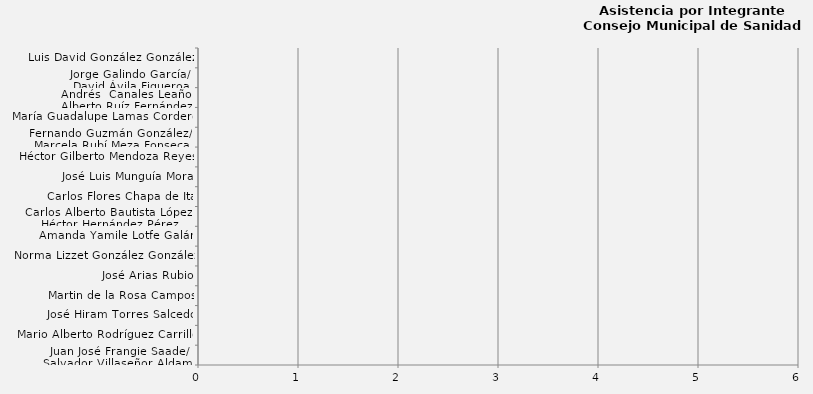
| Category | Series 0 |
|---|---|
| Juan José Frangie Saade/
Salvador Villaseñor Aldama | 0 |
| Mario Alberto Rodríguez Carrillo | 0 |
| José Hiram Torres Salcedo | 0 |
| Martin de la Rosa Campos | 0 |
| José Arias Rubio | 0 |
| Norma Lizzet González González | 0 |
| Amanda Yamile Lotfe Galán | 0 |
| Carlos Alberto Bautista López/
Héctor Hernández Pérez | 0 |
| Carlos Flores Chapa de Ita | 0 |
| José Luis Munguía Mora | 0 |
| Héctor Gilberto Mendoza Reyes | 0 |
| Fernando Guzmán González/ 
Marcela Rubí Meza Fonseca | 0 |
| María Guadalupe Lamas Cordero | 0 |
| Andrés  Canales Leaño/
Alberto Ruíz Fernández | 0 |
| Jorge Galindo García/ 
David Ávila Figueroa | 0 |
| Luis David González González | 0 |